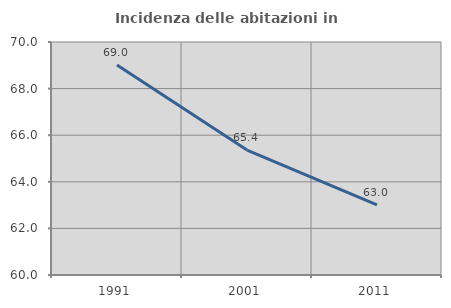
| Category | Incidenza delle abitazioni in proprietà  |
|---|---|
| 1991.0 | 69.013 |
| 2001.0 | 65.364 |
| 2011.0 | 63.011 |